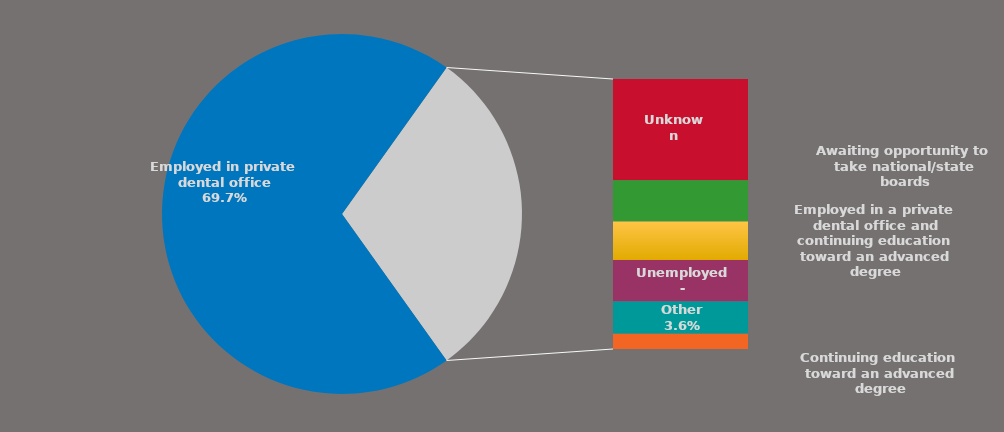
| Category | Series 0 |
|---|---|
| Employed in private dental office | 0.697 |
| Unknown | 0.114 |
| Awaiting opportunity to take national/state boards | 0.046 |
| Employed in a private dental office and continuing education toward an advanced degree | 0.043 |
| Unemployed - | 0.046 |
| Other | 0.036 |
| Continuing education toward an advanced degree | 0.017 |